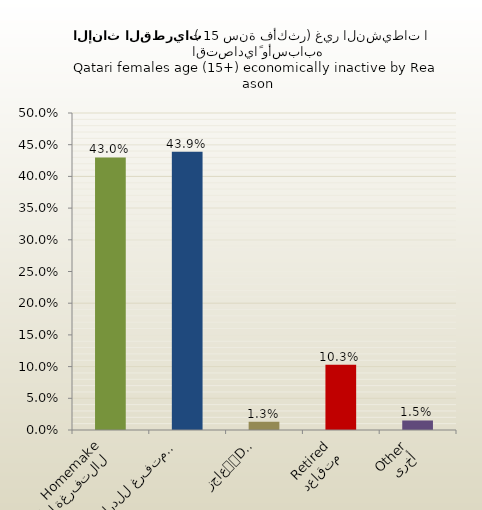
| Category | الاناث القطريات |
|---|---|
| التفرغة لأعمال المنزل
Homemaker | 0.43 |
| متفرغ للدراسة
Student | 0.439 |
| عاجز
Disabled | 0.013 |
| متقاعد
Retired | 0.103 |
| أخرى
Other | 0.015 |